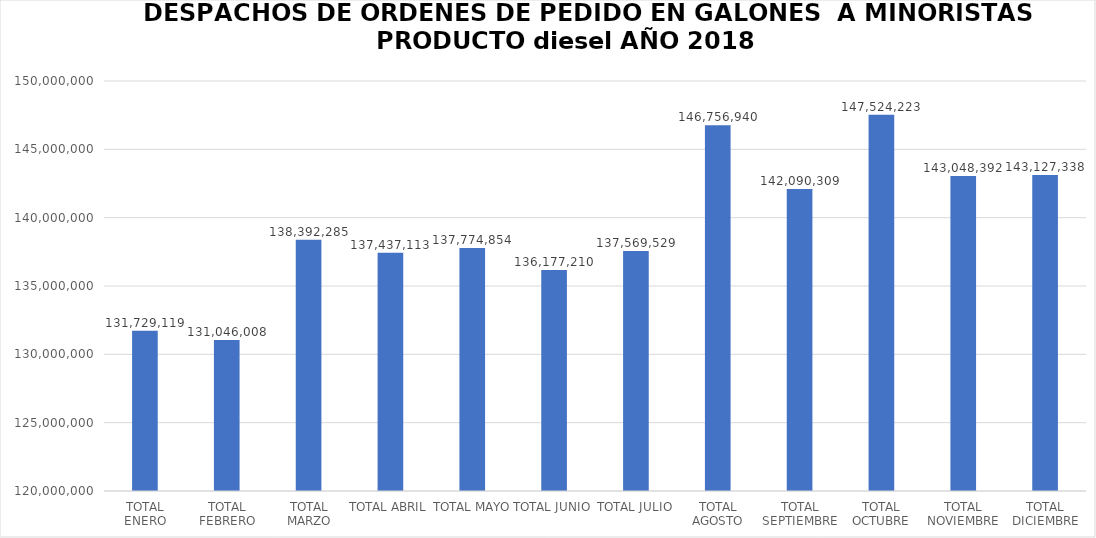
| Category | Series 0 |
|---|---|
| TOTAL ENERO | 131729119 |
| TOTAL FEBRERO | 131046008 |
| TOTAL MARZO | 138392284.95 |
| TOTAL ABRIL | 137437112.82 |
| TOTAL MAYO | 137774854 |
| TOTAL JUNIO | 136177210.26 |
| TOTAL JULIO | 137569528.51 |
| TOTAL AGOSTO | 146756939.85 |
| TOTAL SEPTIEMBRE | 142090309.2 |
| TOTAL OCTUBRE | 147524223.03 |
| TOTAL NOVIEMBRE | 143048392.03 |
| TOTAL DICIEMBRE | 143127338.05 |